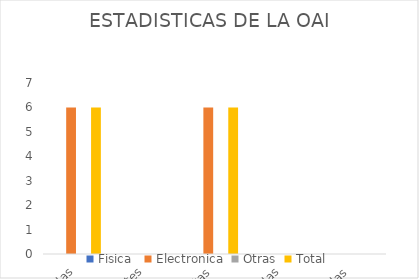
| Category | Fisica  | Electronica | Otras | Total |
|---|---|---|---|---|
| Recibidas | 0 | 6 | 0 | 6 |
| Pendientes | 0 | 0 | 0 | 0 |
| Resueltas | 0 | 6 | 0 | 6 |
| Rechazadas | 0 | 0 | 0 | 0 |
| Transferidas | 0 | 0 | 0 | 0 |